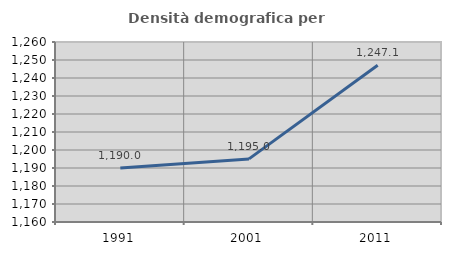
| Category | Densità demografica |
|---|---|
| 1991.0 | 1189.987 |
| 2001.0 | 1195.05 |
| 2011.0 | 1247.082 |